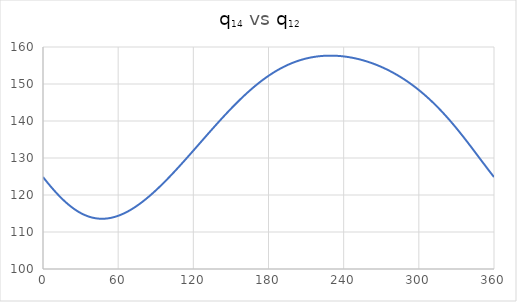
| Category | Series 0 |
|---|---|
| 0.0 | 124.85 |
| 1.0 | 124.423 |
| 2.0 | 124.001 |
| 3.0 | 123.584 |
| 4.0 | 123.171 |
| 5.0 | 122.764 |
| 6.0 | 122.362 |
| 7.0 | 121.966 |
| 8.0 | 121.577 |
| 9.0 | 121.194 |
| 10.0 | 120.818 |
| 11.0 | 120.45 |
| 12.0 | 120.089 |
| 13.0 | 119.736 |
| 14.0 | 119.39 |
| 15.0 | 119.054 |
| 16.0 | 118.725 |
| 17.0 | 118.406 |
| 18.0 | 118.095 |
| 19.0 | 117.794 |
| 20.0 | 117.502 |
| 21.0 | 117.22 |
| 22.0 | 116.948 |
| 23.0 | 116.686 |
| 24.0 | 116.433 |
| 25.0 | 116.192 |
| 26.0 | 115.96 |
| 27.0 | 115.739 |
| 28.0 | 115.528 |
| 29.0 | 115.328 |
| 30.0 | 115.139 |
| 31.0 | 114.961 |
| 32.0 | 114.793 |
| 33.0 | 114.637 |
| 34.0 | 114.491 |
| 35.0 | 114.356 |
| 36.0 | 114.232 |
| 37.0 | 114.119 |
| 38.0 | 114.017 |
| 39.0 | 113.925 |
| 40.0 | 113.845 |
| 41.0 | 113.775 |
| 42.0 | 113.716 |
| 43.0 | 113.667 |
| 44.0 | 113.629 |
| 45.0 | 113.602 |
| 46.0 | 113.585 |
| 47.0 | 113.578 |
| 48.0 | 113.582 |
| 49.0 | 113.595 |
| 50.0 | 113.619 |
| 51.0 | 113.653 |
| 52.0 | 113.696 |
| 53.0 | 113.749 |
| 54.0 | 113.811 |
| 55.0 | 113.883 |
| 56.0 | 113.964 |
| 57.0 | 114.055 |
| 58.0 | 114.154 |
| 59.0 | 114.262 |
| 60.0 | 114.379 |
| 61.0 | 114.505 |
| 62.0 | 114.639 |
| 63.0 | 114.781 |
| 64.0 | 114.932 |
| 65.0 | 115.09 |
| 66.0 | 115.257 |
| 67.0 | 115.431 |
| 68.0 | 115.612 |
| 69.0 | 115.801 |
| 70.0 | 115.998 |
| 71.0 | 116.201 |
| 72.0 | 116.412 |
| 73.0 | 116.629 |
| 74.0 | 116.853 |
| 75.0 | 117.084 |
| 76.0 | 117.321 |
| 77.0 | 117.564 |
| 78.0 | 117.813 |
| 79.0 | 118.069 |
| 80.0 | 118.33 |
| 81.0 | 118.597 |
| 82.0 | 118.869 |
| 83.0 | 119.147 |
| 84.0 | 119.43 |
| 85.0 | 119.718 |
| 86.0 | 120.011 |
| 87.0 | 120.309 |
| 88.0 | 120.611 |
| 89.0 | 120.918 |
| 90.0 | 121.23 |
| 91.0 | 121.546 |
| 92.0 | 121.866 |
| 93.0 | 122.19 |
| 94.0 | 122.518 |
| 95.0 | 122.849 |
| 96.0 | 123.184 |
| 97.0 | 123.523 |
| 98.0 | 123.865 |
| 99.0 | 124.211 |
| 100.0 | 124.559 |
| 101.0 | 124.911 |
| 102.0 | 125.265 |
| 103.0 | 125.622 |
| 104.0 | 125.982 |
| 105.0 | 126.344 |
| 106.0 | 126.709 |
| 107.0 | 127.076 |
| 108.0 | 127.444 |
| 109.0 | 127.815 |
| 110.0 | 128.188 |
| 111.0 | 128.563 |
| 112.0 | 128.939 |
| 113.0 | 129.317 |
| 114.0 | 129.696 |
| 115.0 | 130.076 |
| 116.0 | 130.458 |
| 117.0 | 130.841 |
| 118.0 | 131.224 |
| 119.0 | 131.609 |
| 120.0 | 131.994 |
| 121.0 | 132.379 |
| 122.0 | 132.766 |
| 123.0 | 133.152 |
| 124.0 | 133.539 |
| 125.0 | 133.926 |
| 126.0 | 134.312 |
| 127.0 | 134.699 |
| 128.0 | 135.086 |
| 129.0 | 135.472 |
| 130.0 | 135.858 |
| 131.0 | 136.243 |
| 132.0 | 136.627 |
| 133.0 | 137.011 |
| 134.0 | 137.394 |
| 135.0 | 137.775 |
| 136.0 | 138.156 |
| 137.0 | 138.535 |
| 138.0 | 138.913 |
| 139.0 | 139.29 |
| 140.0 | 139.665 |
| 141.0 | 140.038 |
| 142.0 | 140.41 |
| 143.0 | 140.779 |
| 144.0 | 141.147 |
| 145.0 | 141.512 |
| 146.0 | 141.875 |
| 147.0 | 142.236 |
| 148.0 | 142.594 |
| 149.0 | 142.95 |
| 150.0 | 143.303 |
| 151.0 | 143.653 |
| 152.0 | 144.001 |
| 153.0 | 144.345 |
| 154.0 | 144.687 |
| 155.0 | 145.025 |
| 156.0 | 145.36 |
| 157.0 | 145.691 |
| 158.0 | 146.02 |
| 159.0 | 146.344 |
| 160.0 | 146.665 |
| 161.0 | 146.982 |
| 162.0 | 147.296 |
| 163.0 | 147.605 |
| 164.0 | 147.911 |
| 165.0 | 148.212 |
| 166.0 | 148.51 |
| 167.0 | 148.803 |
| 168.0 | 149.092 |
| 169.0 | 149.377 |
| 170.0 | 149.657 |
| 171.0 | 149.933 |
| 172.0 | 150.204 |
| 173.0 | 150.47 |
| 174.0 | 150.732 |
| 175.0 | 150.99 |
| 176.0 | 151.242 |
| 177.0 | 151.49 |
| 178.0 | 151.733 |
| 179.0 | 151.971 |
| 180.0 | 152.204 |
| 181.0 | 152.433 |
| 182.0 | 152.656 |
| 183.0 | 152.874 |
| 184.0 | 153.088 |
| 185.0 | 153.296 |
| 186.0 | 153.499 |
| 187.0 | 153.698 |
| 188.0 | 153.891 |
| 189.0 | 154.079 |
| 190.0 | 154.262 |
| 191.0 | 154.441 |
| 192.0 | 154.614 |
| 193.0 | 154.782 |
| 194.0 | 154.945 |
| 195.0 | 155.103 |
| 196.0 | 155.256 |
| 197.0 | 155.404 |
| 198.0 | 155.547 |
| 199.0 | 155.685 |
| 200.0 | 155.818 |
| 201.0 | 155.946 |
| 202.0 | 156.069 |
| 203.0 | 156.188 |
| 204.0 | 156.301 |
| 205.0 | 156.41 |
| 206.0 | 156.514 |
| 207.0 | 156.613 |
| 208.0 | 156.708 |
| 209.0 | 156.798 |
| 210.0 | 156.883 |
| 211.0 | 156.964 |
| 212.0 | 157.04 |
| 213.0 | 157.111 |
| 214.0 | 157.178 |
| 215.0 | 157.241 |
| 216.0 | 157.299 |
| 217.0 | 157.353 |
| 218.0 | 157.402 |
| 219.0 | 157.447 |
| 220.0 | 157.488 |
| 221.0 | 157.524 |
| 222.0 | 157.557 |
| 223.0 | 157.585 |
| 224.0 | 157.609 |
| 225.0 | 157.629 |
| 226.0 | 157.645 |
| 227.0 | 157.656 |
| 228.0 | 157.664 |
| 229.0 | 157.668 |
| 230.0 | 157.668 |
| 231.0 | 157.664 |
| 232.0 | 157.656 |
| 233.0 | 157.644 |
| 234.0 | 157.628 |
| 235.0 | 157.609 |
| 236.0 | 157.585 |
| 237.0 | 157.558 |
| 238.0 | 157.528 |
| 239.0 | 157.493 |
| 240.0 | 157.455 |
| 241.0 | 157.413 |
| 242.0 | 157.367 |
| 243.0 | 157.318 |
| 244.0 | 157.265 |
| 245.0 | 157.209 |
| 246.0 | 157.148 |
| 247.0 | 157.085 |
| 248.0 | 157.017 |
| 249.0 | 156.946 |
| 250.0 | 156.872 |
| 251.0 | 156.794 |
| 252.0 | 156.712 |
| 253.0 | 156.627 |
| 254.0 | 156.538 |
| 255.0 | 156.446 |
| 256.0 | 156.35 |
| 257.0 | 156.25 |
| 258.0 | 156.147 |
| 259.0 | 156.04 |
| 260.0 | 155.93 |
| 261.0 | 155.816 |
| 262.0 | 155.699 |
| 263.0 | 155.578 |
| 264.0 | 155.453 |
| 265.0 | 155.325 |
| 266.0 | 155.193 |
| 267.0 | 155.057 |
| 268.0 | 154.918 |
| 269.0 | 154.775 |
| 270.0 | 154.628 |
| 271.0 | 154.478 |
| 272.0 | 154.324 |
| 273.0 | 154.166 |
| 274.0 | 154.004 |
| 275.0 | 153.838 |
| 276.0 | 153.669 |
| 277.0 | 153.496 |
| 278.0 | 153.318 |
| 279.0 | 153.137 |
| 280.0 | 152.952 |
| 281.0 | 152.763 |
| 282.0 | 152.57 |
| 283.0 | 152.373 |
| 284.0 | 152.172 |
| 285.0 | 151.966 |
| 286.0 | 151.757 |
| 287.0 | 151.543 |
| 288.0 | 151.325 |
| 289.0 | 151.103 |
| 290.0 | 150.877 |
| 291.0 | 150.646 |
| 292.0 | 150.411 |
| 293.0 | 150.172 |
| 294.0 | 149.928 |
| 295.0 | 149.68 |
| 296.0 | 149.427 |
| 297.0 | 149.17 |
| 298.0 | 148.909 |
| 299.0 | 148.642 |
| 300.0 | 148.371 |
| 301.0 | 148.096 |
| 302.0 | 147.816 |
| 303.0 | 147.531 |
| 304.0 | 147.241 |
| 305.0 | 146.947 |
| 306.0 | 146.648 |
| 307.0 | 146.344 |
| 308.0 | 146.036 |
| 309.0 | 145.722 |
| 310.0 | 145.404 |
| 311.0 | 145.081 |
| 312.0 | 144.753 |
| 313.0 | 144.421 |
| 314.0 | 144.083 |
| 315.0 | 143.741 |
| 316.0 | 143.394 |
| 317.0 | 143.042 |
| 318.0 | 142.685 |
| 319.0 | 142.324 |
| 320.0 | 141.958 |
| 321.0 | 141.587 |
| 322.0 | 141.212 |
| 323.0 | 140.832 |
| 324.0 | 140.448 |
| 325.0 | 140.059 |
| 326.0 | 139.666 |
| 327.0 | 139.268 |
| 328.0 | 138.866 |
| 329.0 | 138.461 |
| 330.0 | 138.051 |
| 331.0 | 137.637 |
| 332.0 | 137.22 |
| 333.0 | 136.799 |
| 334.0 | 136.375 |
| 335.0 | 135.947 |
| 336.0 | 135.517 |
| 337.0 | 135.083 |
| 338.0 | 134.646 |
| 339.0 | 134.207 |
| 340.0 | 133.766 |
| 341.0 | 133.322 |
| 342.0 | 132.877 |
| 343.0 | 132.43 |
| 344.0 | 131.981 |
| 345.0 | 131.532 |
| 346.0 | 131.081 |
| 347.0 | 130.63 |
| 348.0 | 130.179 |
| 349.0 | 129.727 |
| 350.0 | 129.276 |
| 351.0 | 128.825 |
| 352.0 | 128.375 |
| 353.0 | 127.927 |
| 354.0 | 127.48 |
| 355.0 | 127.035 |
| 356.0 | 126.592 |
| 357.0 | 126.152 |
| 358.0 | 125.714 |
| 359.0 | 125.28 |
| 360.0 | 124.85 |